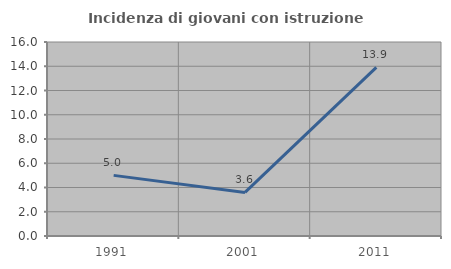
| Category | Incidenza di giovani con istruzione universitaria |
|---|---|
| 1991.0 | 5 |
| 2001.0 | 3.593 |
| 2011.0 | 13.907 |